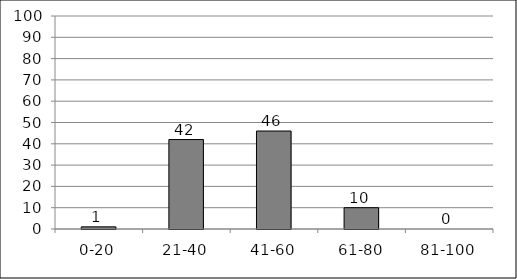
| Category | Series 0 |
|---|---|
| 0-20 | 1 |
| 21-40 | 42 |
| 41-60 | 46 |
| 61-80 | 10 |
| 81-100 | 0 |